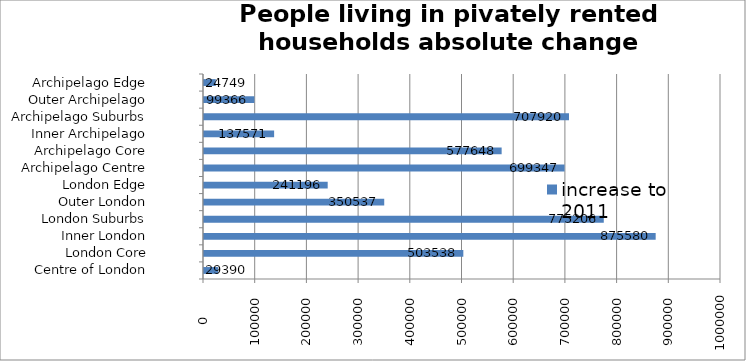
| Category | increase to 2011 |
|---|---|
| Centre of London | 29390 |
| London Core | 503538 |
| Inner London | 875580 |
| London Suburbs | 775206 |
| Outer London | 350537 |
| London Edge | 241196 |
| Archipelago Centre | 699347 |
| Archipelago Core | 577648 |
| Inner Archipelago | 137571 |
| Archipelago Suburbs | 707920 |
| Outer Archipelago | 99366 |
| Archipelago Edge | 24749 |